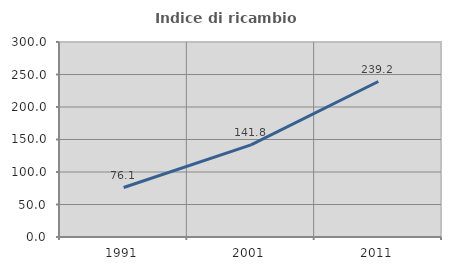
| Category | Indice di ricambio occupazionale  |
|---|---|
| 1991.0 | 76.087 |
| 2001.0 | 141.791 |
| 2011.0 | 239.216 |